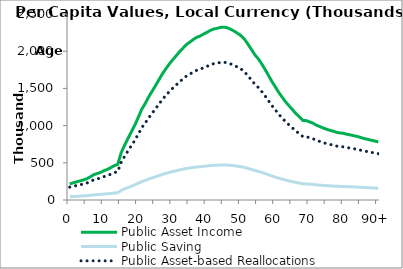
| Category | Public Asset Income | Public Saving | Public Asset-based Reallocations |
|---|---|---|---|
| 0 | 217145.093 | 44043.916 | 173101.176 |
|  | 230394.717 | 46731.361 | 183663.357 |
| 2 | 243644.342 | 49418.805 | 194225.537 |
| 3 | 256893.967 | 52106.25 | 204787.717 |
| 4 | 270143.592 | 54793.694 | 215349.898 |
| 5 | 286025.073 | 58014.963 | 228010.111 |
| 6 | 311249.451 | 63131.267 | 248118.184 |
| 7 | 339810.25 | 68924.303 | 270885.946 |
| 8 | 355842.228 | 72176.097 | 283666.131 |
| 9 | 370387.712 | 75126.383 | 295261.329 |
| 10 | 394158.446 | 79947.842 | 314210.603 |
| 11 | 411086.346 | 83381.358 | 327704.989 |
| 12 | 435431.252 | 88319.277 | 347111.975 |
| 13 | 461528.995 | 93612.728 | 367916.267 |
| 14 | 478687.634 | 97093.045 | 381594.59 |
| 15 | 633653.15 | 128524.969 | 505128.181 |
| 16 | 734798.54 | 149040.465 | 585758.076 |
| 17 | 828574.317 | 168061.168 | 660513.149 |
| 18 | 918166.146 | 186233.235 | 731932.912 |
| 19 | 1006944.78 | 204240.359 | 802704.42 |
| 20 | 1112035.098 | 225556.011 | 886479.087 |
| 21 | 1218771.827 | 247205.607 | 971566.22 |
| 22 | 1295279.1 | 262723.71 | 1032555.39 |
| 23 | 1382617.765 | 280438.763 | 1102179.002 |
| 24 | 1459304.09 | 295993.184 | 1163310.906 |
| 25 | 1535306.066 | 311408.797 | 1223897.27 |
| 26 | 1614549.729 | 327481.927 | 1287067.802 |
| 27 | 1692682.2 | 343329.671 | 1349352.529 |
| 28 | 1760955.672 | 357177.698 | 1403777.974 |
| 29 | 1825314.152 | 370231.641 | 1455082.511 |
| 30 | 1882918.532 | 381915.637 | 1501002.895 |
| 31 | 1935791.321 | 392639.917 | 1543151.404 |
| 32 | 1992620.716 | 404166.722 | 1588453.995 |
| 33 | 2039103.108 | 413594.826 | 1625508.282 |
| 34 | 2088265.845 | 423566.589 | 1664699.255 |
| 35 | 2121034.221 | 430213.056 | 1690821.165 |
| 36 | 2155052.822 | 437113.108 | 1717939.714 |
| 37 | 2186167.926 | 443424.239 | 1742743.687 |
| 38 | 2202737.652 | 446785.105 | 1755952.547 |
| 39 | 2229496.313 | 452212.611 | 1777283.703 |
| 40 | 2252750.473 | 456929.292 | 1795821.181 |
| 41 | 2279257.641 | 462305.787 | 1816951.854 |
| 42 | 2298339.675 | 466176.229 | 1832163.446 |
| 43 | 2307205.91 | 467974.583 | 1839231.327 |
| 44 | 2320800.316 | 470731.96 | 1850068.356 |
| 45 | 2322729.7 | 471123.3 | 1851606.399 |
| 46 | 2313907.053 | 469333.788 | 1844573.265 |
| 47 | 2292935.812 | 465080.154 | 1827855.658 |
| 48 | 2269424.507 | 460311.316 | 1809113.192 |
| 49 | 2238419.425 | 454022.501 | 1784396.924 |
| 50 | 2207334.98 | 447717.589 | 1759617.391 |
| 51 | 2159197.93 | 437953.867 | 1721244.063 |
| 52 | 2093708.938 | 424670.621 | 1669038.316 |
| 53 | 2023751.395 | 410481.011 | 1613270.383 |
| 54 | 1951599.729 | 395846.364 | 1555753.365 |
| 55 | 1897886.988 | 384951.715 | 1512935.273 |
| 56 | 1829270.054 | 371034.023 | 1458236.031 |
| 57 | 1753884.338 | 355743.407 | 1398140.931 |
| 58 | 1672000.523 | 339134.771 | 1332865.752 |
| 59 | 1590258.895 | 322554.975 | 1267703.921 |
| 60 | 1518327.372 | 307964.979 | 1210362.393 |
| 61 | 1443147.599 | 292716.135 | 1150431.464 |
| 62 | 1380269.562 | 279962.473 | 1100307.089 |
| 63 | 1317684.338 | 267268.204 | 1050416.134 |
| 64 | 1264788.503 | 256539.249 | 1008249.254 |
| 65 | 1212462.522 | 245925.88 | 966536.642 |
| 66 | 1160248.284 | 235335.175 | 924913.108 |
| 67 | 1117122.012 | 226587.799 | 890534.214 |
| 68 | 1069576.593 | 216944.079 | 852632.515 |
| 69 | 1066708.287 | 216362.295 | 850345.992 |
| 70 | 1049196.462 | 212810.341 | 836386.121 |
| 71 | 1031546.92 | 209230.454 | 822316.466 |
| 72 | 1004239.906 | 203691.725 | 800548.181 |
| 73 | 985884.079 | 199968.581 | 785915.499 |
| 74 | 966496.861 | 196036.238 | 770460.624 |
| 75 | 949589.935 | 192606.976 | 756982.959 |
| 76 | 935487.345 | 189746.523 | 745740.821 |
| 77 | 923420.688 | 187299.022 | 736121.665 |
| 78 | 907078.217 | 183984.251 | 723093.967 |
| 79 | 901159.794 | 182783.807 | 718375.988 |
| 80 | 893945.641 | 181320.547 | 712625.093 |
| 81 | 882313.302 | 178961.14 | 703352.162 |
| 82 | 873274.029 | 177127.688 | 696146.341 |
| 83 | 863166.604 | 175077.582 | 688089.022 |
| 84 | 852534.405 | 172921.034 | 679613.37 |
| 85 | 837968.498 | 169966.606 | 668001.892 |
| 86 | 825164.944 | 167369.639 | 657795.305 |
| 87 | 814079.668 | 165121.193 | 648958.475 |
| 88 | 802994.392 | 162872.748 | 640121.644 |
| 89 | 791909.116 | 160624.302 | 631284.814 |
| 90+ | 780823.84 | 158375.856 | 622447.984 |